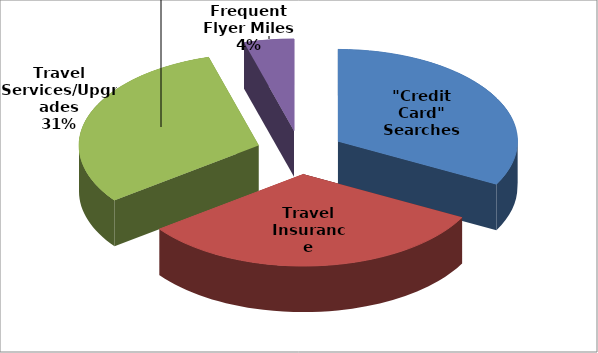
| Category | Total |
|---|---|
| "Credit Card" Searches | 596639 |
| Travel Insurance | 583406 |
| Travel Services/Upgrades | 558911 |
| Frequent Flyer Miles | 81720 |